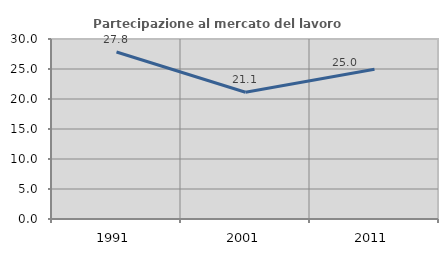
| Category | Partecipazione al mercato del lavoro  femminile |
|---|---|
| 1991.0 | 27.837 |
| 2001.0 | 21.122 |
| 2011.0 | 24.953 |